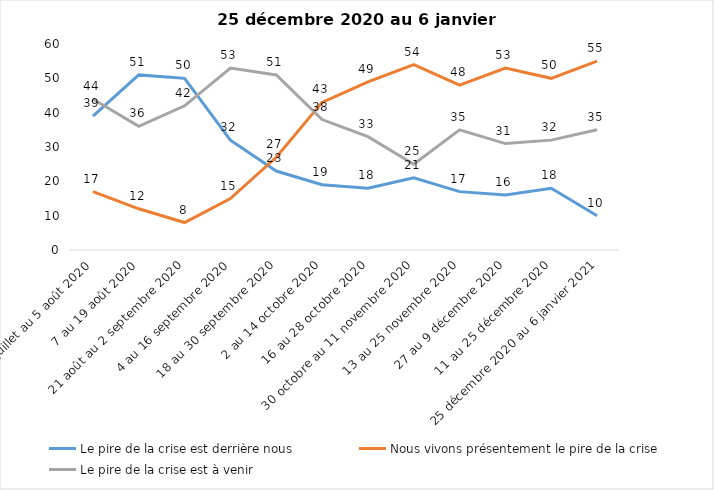
| Category | Le pire de la crise est derrière nous | Nous vivons présentement le pire de la crise | Le pire de la crise est à venir |
|---|---|---|---|
| 24 juillet au 5 août 2020 | 39 | 17 | 44 |
| 7 au 19 août 2020 | 51 | 12 | 36 |
| 21 août au 2 septembre 2020 | 50 | 8 | 42 |
| 4 au 16 septembre 2020 | 32 | 15 | 53 |
| 18 au 30 septembre 2020 | 23 | 27 | 51 |
| 2 au 14 octobre 2020 | 19 | 43 | 38 |
| 16 au 28 octobre 2020 | 18 | 49 | 33 |
| 30 octobre au 11 novembre 2020 | 21 | 54 | 25 |
| 13 au 25 novembre 2020 | 17 | 48 | 35 |
| 27 au 9 décembre 2020 | 16 | 53 | 31 |
| 11 au 25 décembre 2020 | 18 | 50 | 32 |
| 25 décembre 2020 au 6 janvier 2021 | 10 | 55 | 35 |